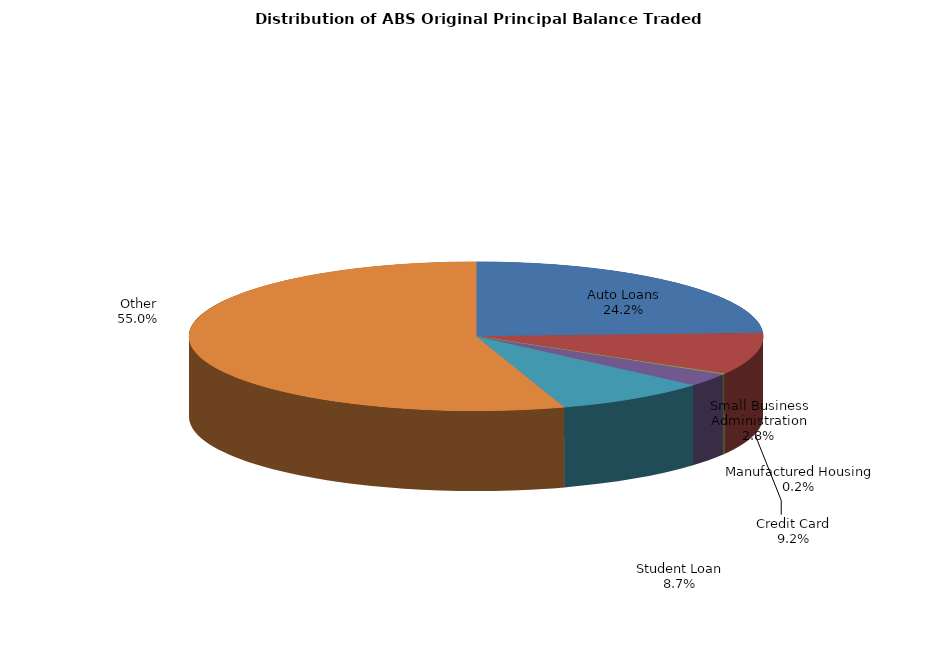
| Category | Series 0 |
|---|---|
| Auto Loans | 601720572.079 |
| Credit Card | 227454122.016 |
| Manufactured Housing | 4640357.996 |
| Small Business Administration | 69667740.571 |
| Student Loan | 215522278.683 |
| Other | 1365816174.355 |